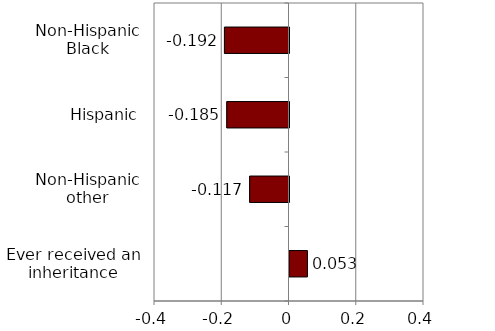
| Category | Series 0 |
|---|---|
| Ever received an inheritance | 0.053 |
| Non-Hispanic other | -0.117 |
| Hispanic | -0.185 |
| Non-Hispanic Black | -0.192 |